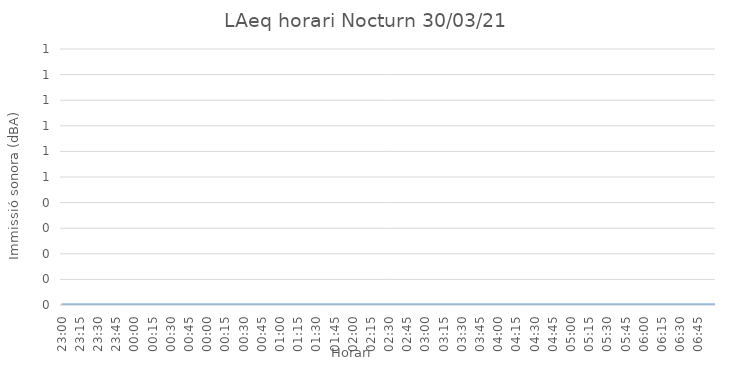
| Category | LAeq horari Nocturn 30/03/21 |
|---|---|
| 23:00 | 0 |
| 23:01 | 0 |
| 23:02 | 0 |
| 23:03 | 0 |
| 23:04 | 0 |
| 23:05 | 0 |
| 23:06 | 0 |
| 23:07 | 0 |
| 23:08 | 0 |
| 23:09 | 0 |
| 23:10 | 0 |
| 23:11 | 0 |
| 23:12 | 0 |
| 23:13 | 0 |
| 23:14 | 0 |
| 23:15 | 0 |
| 23:16 | 0 |
| 23:17 | 0 |
| 23:18 | 0 |
| 23:19 | 0 |
| 23:20 | 0 |
| 23:21 | 0 |
| 23:22 | 0 |
| 23:23 | 0 |
| 23:24 | 0 |
| 23:25 | 0 |
| 23:26 | 0 |
| 23:27 | 0 |
| 23:28 | 0 |
| 23:29 | 0 |
| 23:30 | 0 |
| 23:31 | 0 |
| 23:32 | 0 |
| 23:33 | 0 |
| 23:34 | 0 |
| 23:35 | 0 |
| 23:36 | 0 |
| 23:37 | 0 |
| 23:38 | 0 |
| 23:39 | 0 |
| 23:40 | 0 |
| 23:41 | 0 |
| 23:42 | 0 |
| 23:43 | 0 |
| 23:44 | 0 |
| 23:45 | 0 |
| 23:46 | 0 |
| 23:47 | 0 |
| 23:48 | 0 |
| 23:49 | 0 |
| 23:50 | 0 |
| 23:51 | 0 |
| 23:52 | 0 |
| 23:53 | 0 |
| 23:54 | 0 |
| 23:55 | 0 |
| 23:56 | 0 |
| 23:57 | 0 |
| 23:58 | 0 |
| 23:59 | 0 |
| 00:00 | 0 |
| 00:01 | 0 |
| 00:02 | 0 |
| 00:03 | 0 |
| 00:04 | 0 |
| 00:05 | 0 |
| 00:06 | 0 |
| 00:07 | 0 |
| 00:08 | 0 |
| 00:09 | 0 |
| 00:10 | 0 |
| 00:11 | 0 |
| 00:12 | 0 |
| 00:13 | 0 |
| 00:14 | 0 |
| 00:15 | 0 |
| 00:16 | 0 |
| 00:17 | 0 |
| 00:18 | 0 |
| 00:19 | 0 |
| 00:20 | 0 |
| 00:21 | 0 |
| 00:22 | 0 |
| 00:23 | 0 |
| 00:24 | 0 |
| 00:25 | 0 |
| 00:26 | 0 |
| 00:27 | 0 |
| 00:28 | 0 |
| 00:29 | 0 |
| 00:30 | 0 |
| 00:31 | 0 |
| 00:32 | 0 |
| 00:33 | 0 |
| 00:34 | 0 |
| 00:35 | 0 |
| 00:36 | 0 |
| 00:37 | 0 |
| 00:38 | 0 |
| 00:39 | 0 |
| 00:40 | 0 |
| 00:41 | 0 |
| 00:42 | 0 |
| 00:43 | 0 |
| 00:44 | 0 |
| 00:45 | 0 |
| 00:46 | 0 |
| 00:47 | 0 |
| 00:48 | 0 |
| 00:49 | 0 |
| 00:50 | 0 |
| 00:51 | 0 |
| 00:52 | 0 |
| 00:53 | 0 |
| 00:54 | 0 |
| 00:55 | 0 |
| 00:56 | 0 |
| 00:57 | 0 |
| 00:58 | 0 |
| 00:59 | 0 |
| 00:00 | 0 |
| 00:01 | 0 |
| 00:02 | 0 |
| 00:03 | 0 |
| 00:04 | 0 |
| 00:05 | 0 |
| 00:06 | 0 |
| 00:07 | 0 |
| 00:08 | 0 |
| 00:09 | 0 |
| 00:10 | 0 |
| 00:11 | 0 |
| 00:12 | 0 |
| 00:13 | 0 |
| 00:14 | 0 |
| 00:15 | 0 |
| 00:16 | 0 |
| 00:17 | 0 |
| 00:18 | 0 |
| 00:19 | 0 |
| 00:20 | 0 |
| 00:21 | 0 |
| 00:22 | 0 |
| 00:23 | 0 |
| 00:24 | 0 |
| 00:25 | 0 |
| 00:26 | 0 |
| 00:27 | 0 |
| 00:28 | 0 |
| 00:29 | 0 |
| 00:30 | 0 |
| 00:31 | 0 |
| 00:32 | 0 |
| 00:33 | 0 |
| 00:34 | 0 |
| 00:35 | 0 |
| 00:36 | 0 |
| 00:37 | 0 |
| 00:38 | 0 |
| 00:39 | 0 |
| 00:40 | 0 |
| 00:41 | 0 |
| 00:42 | 0 |
| 00:43 | 0 |
| 00:44 | 0 |
| 00:45 | 0 |
| 00:46 | 0 |
| 00:47 | 0 |
| 00:48 | 0 |
| 00:49 | 0 |
| 00:50 | 0 |
| 00:51 | 0 |
| 00:52 | 0 |
| 00:53 | 0 |
| 00:54 | 0 |
| 00:55 | 0 |
| 00:56 | 0 |
| 00:57 | 0 |
| 00:58 | 0 |
| 00:59 | 0 |
| 01:00 | 0 |
| 01:01 | 0 |
| 01:02 | 0 |
| 01:03 | 0 |
| 01:04 | 0 |
| 01:05 | 0 |
| 01:06 | 0 |
| 01:07 | 0 |
| 01:08 | 0 |
| 01:09 | 0 |
| 01:10 | 0 |
| 01:11 | 0 |
| 01:12 | 0 |
| 01:13 | 0 |
| 01:14 | 0 |
| 01:15 | 0 |
| 01:16 | 0 |
| 01:17 | 0 |
| 01:18 | 0 |
| 01:19 | 0 |
| 01:20 | 0 |
| 01:21 | 0 |
| 01:22 | 0 |
| 01:23 | 0 |
| 01:24 | 0 |
| 01:25 | 0 |
| 01:26 | 0 |
| 01:27 | 0 |
| 01:28 | 0 |
| 01:29 | 0 |
| 01:30 | 0 |
| 01:31 | 0 |
| 01:32 | 0 |
| 01:33 | 0 |
| 01:34 | 0 |
| 01:35 | 0 |
| 01:36 | 0 |
| 01:37 | 0 |
| 01:38 | 0 |
| 01:39 | 0 |
| 01:40 | 0 |
| 01:41 | 0 |
| 01:42 | 0 |
| 01:43 | 0 |
| 01:44 | 0 |
| 01:45 | 0 |
| 01:46 | 0 |
| 01:47 | 0 |
| 01:48 | 0 |
| 01:49 | 0 |
| 01:50 | 0 |
| 01:51 | 0 |
| 01:52 | 0 |
| 01:53 | 0 |
| 01:54 | 0 |
| 01:55 | 0 |
| 01:56 | 0 |
| 01:57 | 0 |
| 01:58 | 0 |
| 01:59 | 0 |
| 02:00 | 0 |
| 02:01 | 0 |
| 02:02 | 0 |
| 02:03 | 0 |
| 02:04 | 0 |
| 02:05 | 0 |
| 02:06 | 0 |
| 02:07 | 0 |
| 02:08 | 0 |
| 02:09 | 0 |
| 02:10 | 0 |
| 02:11 | 0 |
| 02:12 | 0 |
| 02:13 | 0 |
| 02:14 | 0 |
| 02:15 | 0 |
| 02:16 | 0 |
| 02:17 | 0 |
| 02:18 | 0 |
| 02:19 | 0 |
| 02:20 | 0 |
| 02:21 | 0 |
| 02:22 | 0 |
| 02:23 | 0 |
| 02:24 | 0 |
| 02:25 | 0 |
| 02:26 | 0 |
| 02:27 | 0 |
| 02:28 | 0 |
| 02:29 | 0 |
| 02:30 | 0 |
| 02:31 | 0 |
| 02:32 | 0 |
| 02:33 | 0 |
| 02:34 | 0 |
| 02:35 | 0 |
| 02:36 | 0 |
| 02:37 | 0 |
| 02:38 | 0 |
| 02:39 | 0 |
| 02:40 | 0 |
| 02:41 | 0 |
| 02:42 | 0 |
| 02:43 | 0 |
| 02:44 | 0 |
| 02:45 | 0 |
| 02:46 | 0 |
| 02:47 | 0 |
| 02:48 | 0 |
| 02:49 | 0 |
| 02:50 | 0 |
| 02:51 | 0 |
| 02:52 | 0 |
| 02:53 | 0 |
| 02:54 | 0 |
| 02:55 | 0 |
| 02:56 | 0 |
| 02:57 | 0 |
| 02:58 | 0 |
| 02:59 | 0 |
| 03:00 | 0 |
| 03:01 | 0 |
| 03:02 | 0 |
| 03:03 | 0 |
| 03:04 | 0 |
| 03:05 | 0 |
| 03:06 | 0 |
| 03:07 | 0 |
| 03:08 | 0 |
| 03:09 | 0 |
| 03:10 | 0 |
| 03:11 | 0 |
| 03:12 | 0 |
| 03:13 | 0 |
| 03:14 | 0 |
| 03:15 | 0 |
| 03:16 | 0 |
| 03:17 | 0 |
| 03:18 | 0 |
| 03:19 | 0 |
| 03:20 | 0 |
| 03:21 | 0 |
| 03:22 | 0 |
| 03:23 | 0 |
| 03:24 | 0 |
| 03:25 | 0 |
| 03:26 | 0 |
| 03:27 | 0 |
| 03:28 | 0 |
| 03:29 | 0 |
| 03:30 | 0 |
| 03:31 | 0 |
| 03:32 | 0 |
| 03:33 | 0 |
| 03:34 | 0 |
| 03:35 | 0 |
| 03:36 | 0 |
| 03:37 | 0 |
| 03:38 | 0 |
| 03:39 | 0 |
| 03:40 | 0 |
| 03:41 | 0 |
| 03:42 | 0 |
| 03:43 | 0 |
| 03:44 | 0 |
| 03:45 | 0 |
| 03:46 | 0 |
| 03:47 | 0 |
| 03:48 | 0 |
| 03:49 | 0 |
| 03:50 | 0 |
| 03:51 | 0 |
| 03:52 | 0 |
| 03:53 | 0 |
| 03:54 | 0 |
| 03:55 | 0 |
| 03:56 | 0 |
| 03:57 | 0 |
| 03:58 | 0 |
| 03:59 | 0 |
| 04:00 | 0 |
| 04:01 | 0 |
| 04:02 | 0 |
| 04:03 | 0 |
| 04:04 | 0 |
| 04:05 | 0 |
| 04:06 | 0 |
| 04:07 | 0 |
| 04:08 | 0 |
| 04:09 | 0 |
| 04:10 | 0 |
| 04:11 | 0 |
| 04:12 | 0 |
| 04:13 | 0 |
| 04:14 | 0 |
| 04:15 | 0 |
| 04:16 | 0 |
| 04:17 | 0 |
| 04:18 | 0 |
| 04:19 | 0 |
| 04:20 | 0 |
| 04:21 | 0 |
| 04:22 | 0 |
| 04:23 | 0 |
| 04:24 | 0 |
| 04:25 | 0 |
| 04:26 | 0 |
| 04:27 | 0 |
| 04:28 | 0 |
| 04:29 | 0 |
| 04:30 | 0 |
| 04:31 | 0 |
| 04:32 | 0 |
| 04:33 | 0 |
| 04:34 | 0 |
| 04:35 | 0 |
| 04:36 | 0 |
| 04:37 | 0 |
| 04:38 | 0 |
| 04:39 | 0 |
| 04:40 | 0 |
| 04:41 | 0 |
| 04:42 | 0 |
| 04:43 | 0 |
| 04:44 | 0 |
| 04:45 | 0 |
| 04:46 | 0 |
| 04:47 | 0 |
| 04:48 | 0 |
| 04:49 | 0 |
| 04:50 | 0 |
| 04:51 | 0 |
| 04:52 | 0 |
| 04:53 | 0 |
| 04:54 | 0 |
| 04:55 | 0 |
| 04:56 | 0 |
| 04:57 | 0 |
| 04:58 | 0 |
| 04:59 | 0 |
| 05:00 | 0 |
| 05:01 | 0 |
| 05:02 | 0 |
| 05:03 | 0 |
| 05:04 | 0 |
| 05:05 | 0 |
| 05:06 | 0 |
| 05:07 | 0 |
| 05:08 | 0 |
| 05:09 | 0 |
| 05:10 | 0 |
| 05:11 | 0 |
| 05:12 | 0 |
| 05:13 | 0 |
| 05:14 | 0 |
| 05:15 | 0 |
| 05:16 | 0 |
| 05:17 | 0 |
| 05:18 | 0 |
| 05:19 | 0 |
| 05:20 | 0 |
| 05:21 | 0 |
| 05:22 | 0 |
| 05:23 | 0 |
| 05:24 | 0 |
| 05:25 | 0 |
| 05:26 | 0 |
| 05:27 | 0 |
| 05:28 | 0 |
| 05:29 | 0 |
| 05:30 | 0 |
| 05:31 | 0 |
| 05:32 | 0 |
| 05:33 | 0 |
| 05:34 | 0 |
| 05:35 | 0 |
| 05:36 | 0 |
| 05:37 | 0 |
| 05:38 | 0 |
| 05:39 | 0 |
| 05:40 | 0 |
| 05:41 | 0 |
| 05:42 | 0 |
| 05:43 | 0 |
| 05:44 | 0 |
| 05:45 | 0 |
| 05:46 | 0 |
| 05:47 | 0 |
| 05:48 | 0 |
| 05:49 | 0 |
| 05:50 | 0 |
| 05:51 | 0 |
| 05:52 | 0 |
| 05:53 | 0 |
| 05:54 | 0 |
| 05:55 | 0 |
| 05:56 | 0 |
| 05:57 | 0 |
| 05:58 | 0 |
| 05:59 | 0 |
| 06:00 | 0 |
| 06:01 | 0 |
| 06:02 | 0 |
| 06:03 | 0 |
| 06:04 | 0 |
| 06:05 | 0 |
| 06:06 | 0 |
| 06:07 | 0 |
| 06:08 | 0 |
| 06:09 | 0 |
| 06:10 | 0 |
| 06:11 | 0 |
| 06:12 | 0 |
| 06:13 | 0 |
| 06:14 | 0 |
| 06:15 | 0 |
| 06:16 | 0 |
| 06:17 | 0 |
| 06:18 | 0 |
| 06:19 | 0 |
| 06:20 | 0 |
| 06:21 | 0 |
| 06:22 | 0 |
| 06:23 | 0 |
| 06:24 | 0 |
| 06:25 | 0 |
| 06:26 | 0 |
| 06:27 | 0 |
| 06:28 | 0 |
| 06:29 | 0 |
| 06:30 | 0 |
| 06:31 | 0 |
| 06:32 | 0 |
| 06:33 | 0 |
| 06:34 | 0 |
| 06:35 | 0 |
| 06:36 | 0 |
| 06:37 | 0 |
| 06:38 | 0 |
| 06:39 | 0 |
| 06:40 | 0 |
| 06:41 | 0 |
| 06:42 | 0 |
| 06:43 | 0 |
| 06:44 | 0 |
| 06:45 | 0 |
| 06:46 | 0 |
| 06:47 | 0 |
| 06:48 | 0 |
| 06:49 | 0 |
| 06:50 | 0 |
| 06:51 | 0 |
| 06:52 | 0 |
| 06:53 | 0 |
| 06:54 | 0 |
| 06:55 | 0 |
| 06:56 | 0 |
| 06:57 | 0 |
| 06:58 | 0 |
| 06:59 | 0 |